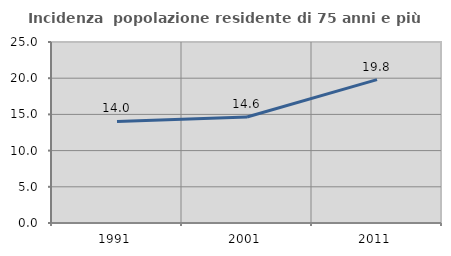
| Category | Incidenza  popolazione residente di 75 anni e più |
|---|---|
| 1991.0 | 14.035 |
| 2001.0 | 14.638 |
| 2011.0 | 19.803 |